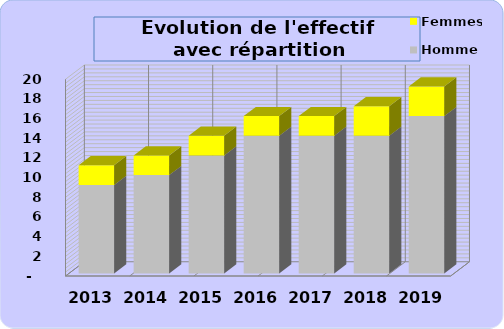
| Category | Hommes | Femmes |
|---|---|---|
| 2013.0 | 9 | 2 |
| 2014.0 | 10 | 2 |
| 2015.0 | 12 | 2 |
| 2016.0 | 14 | 2 |
| 2017.0 | 14 | 2 |
| 2018.0 | 14 | 3 |
| 2019.0 | 16 | 3 |